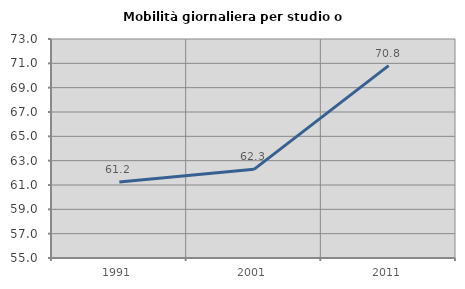
| Category | Mobilità giornaliera per studio o lavoro |
|---|---|
| 1991.0 | 61.242 |
| 2001.0 | 62.287 |
| 2011.0 | 70.807 |